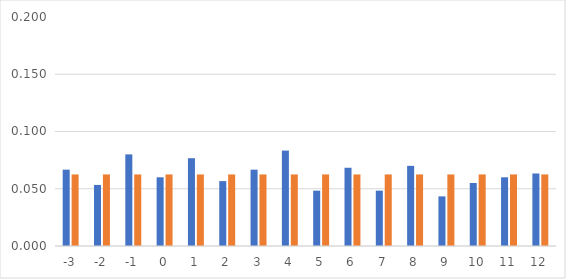
| Category | rel freq | prob |
|---|---|---|
| -3.0 | 0.067 | 0.062 |
| -2.0 | 0.053 | 0.062 |
| -1.0 | 0.08 | 0.062 |
| 0.0 | 0.06 | 0.062 |
| 1.0 | 0.077 | 0.062 |
| 2.0 | 0.057 | 0.062 |
| 3.0 | 0.067 | 0.062 |
| 4.0 | 0.083 | 0.062 |
| 5.0 | 0.048 | 0.062 |
| 6.0 | 0.068 | 0.062 |
| 7.0 | 0.048 | 0.062 |
| 8.0 | 0.07 | 0.062 |
| 9.0 | 0.043 | 0.062 |
| 10.0 | 0.055 | 0.062 |
| 11.0 | 0.06 | 0.062 |
| 12.0 | 0.063 | 0.062 |